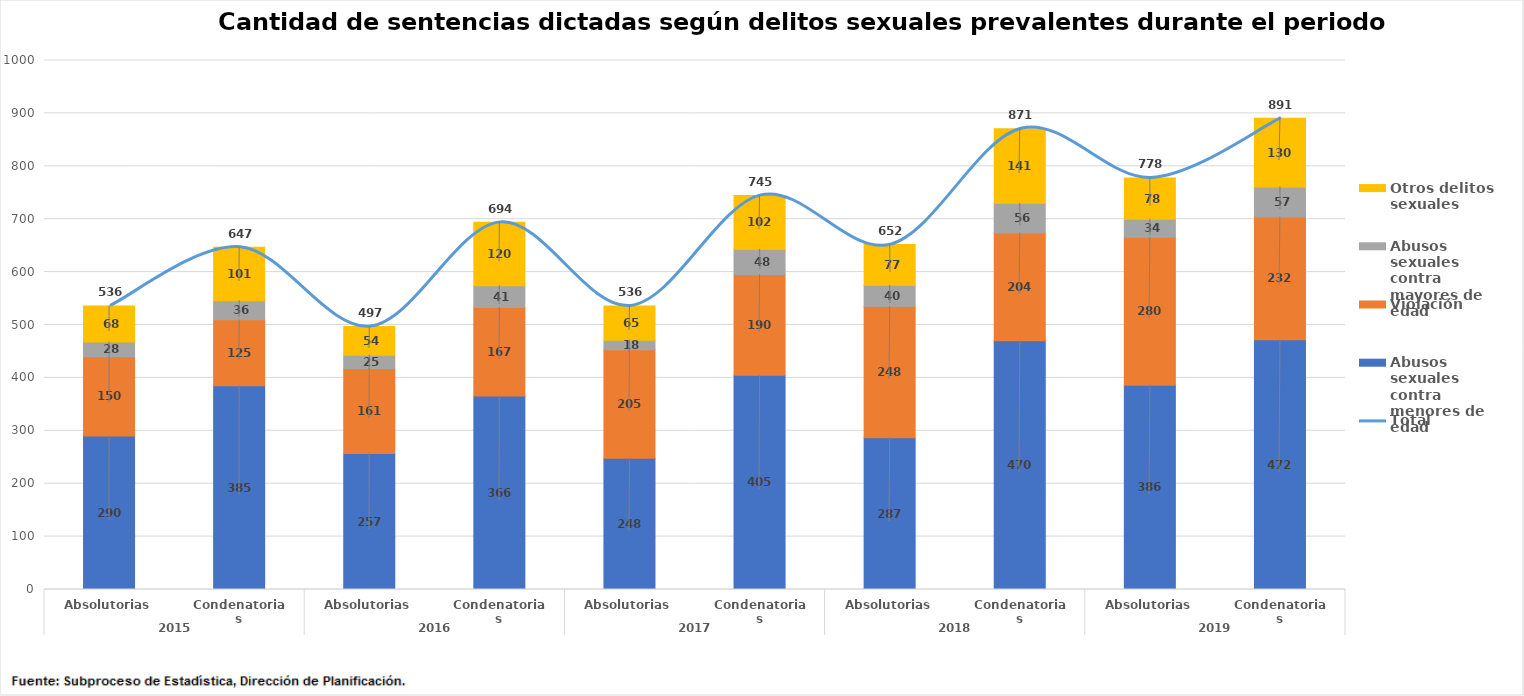
| Category | Abusos sexuales contra menores de edad | Violación | Abusos sexuales contra mayores de edad | Otros delitos sexuales |
|---|---|---|---|---|
| 0 | 290 | 150 | 28 | 68 |
| 1 | 385 | 125 | 36 | 101 |
| 2 | 257 | 161 | 25 | 54 |
| 3 | 366 | 167 | 41 | 120 |
| 4 | 248 | 205 | 18 | 65 |
| 5 | 405 | 190 | 48 | 102 |
| 6 | 287 | 248 | 40 | 77 |
| 7 | 470 | 204 | 56 | 141 |
| 8 | 386 | 280 | 34 | 78 |
| 9 | 472 | 232 | 57 | 130 |